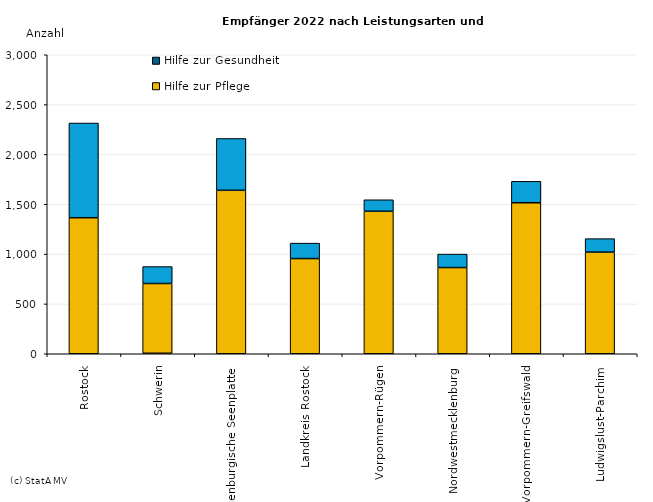
| Category | Hilfe zur Gesundheit | Hilfe zur Pflege | Hilfe zur Überwindung besonderer sozialer Schwierigkeiten und Hilfen in anderen Lebenslagen |
|---|---|---|---|
|    Rostock | 0 | 1365 | 950 |
|    Schwerin | 5 | 700 | 170 |
|    Mecklenburgische Seenplatte | 0 | 1640 | 520 |
|    Landkreis Rostock | 0 | 955 | 155 |
|    Vorpommern-Rügen | 0 | 1430 | 115 |
|    Nordwestmecklenburg | 0 | 865 | 135 |
|    Vorpommern-Greifswald | 0 | 1515 | 215 |
|    Ludwigslust-Parchim | 0 | 1020 | 135 |